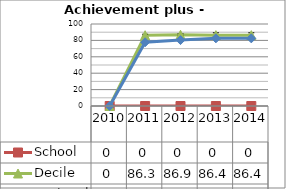
| Category | School  | Decile | National |
|---|---|---|---|
| 2010.0 | 0 | 0 | 0 |
| 2011.0 | 0 | 86.3 | 77.7 |
| 2012.0 | 0 | 86.9 | 80.4 |
| 2013.0 | 0 | 86.4 | 82.5 |
| 2014.0 | 0 | 86.4 | 82.5 |